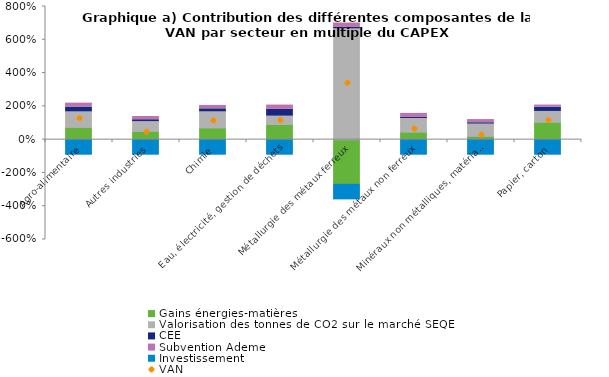
| Category | Gains énergies-matières | Valorisation des tonnes de CO2 sur le marché SEQE | CEE | Subvention Ademe | Investissement |
|---|---|---|---|---|---|
| Agro-alimentaire | 0.734 | 0.999 | 0.225 | 0.236 | -0.935 |
| Autres industries | 0.495 | 0.65 | 0.052 | 0.193 | -0.935 |
| Chimie | 0.705 | 1.03 | 0.117 | 0.202 | -0.935 |
| Eau, électricité, gestion de déchets | 0.909 | 0.567 | 0.34 | 0.261 | -0.935 |
| Métallurgie des métaux ferreux | -2.684 | 6.723 | 0.018 | 0.266 | -0.935 |
| Métallurgie des métaux non ferreux | 0.45 | 0.881 | 0.002 | 0.245 | -0.935 |
| Minéraux non métalliques, matériaux de construction | 0.199 | 0.802 | 0.014 | 0.192 | -0.935 |
| Papier, carton | 1.042 | 0.714 | 0.187 | 0.135 | -0.935 |